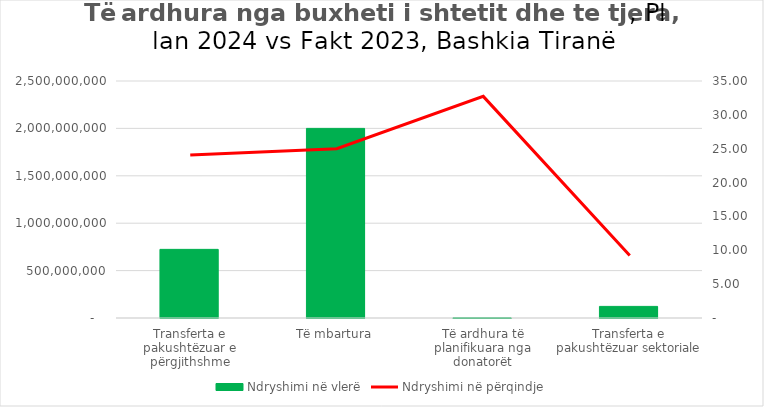
| Category | Ndryshimi në vlerë |
|---|---|
| Transferta e pakushtëzuar e përgjithshme | 723895402 |
| Të mbartura | 2000000000 |
| Të ardhura të planifikuara nga donatorët | 1894260 |
| Transferta e pakushtëzuar sektoriale | 122373327 |